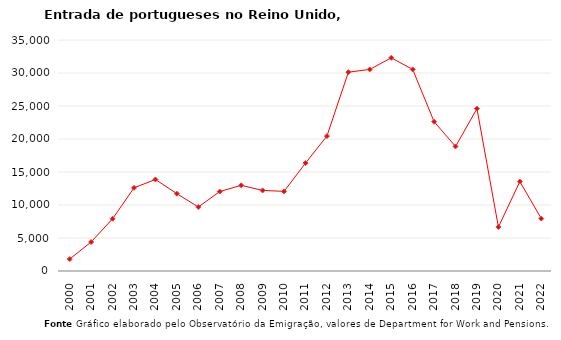
| Category | Entradas |
|---|---|
| 2000.0 | 1811 |
| 2001.0 | 4396 |
| 2002.0 | 7915 |
| 2003.0 | 12603 |
| 2004.0 | 13867 |
| 2005.0 | 11712 |
| 2006.0 | 9696 |
| 2007.0 | 12039 |
| 2008.0 | 12983 |
| 2009.0 | 12211 |
| 2010.0 | 12064 |
| 2011.0 | 16347 |
| 2012.0 | 20443 |
| 2013.0 | 30121 |
| 2014.0 | 30546 |
| 2015.0 | 32301 |
| 2016.0 | 30543 |
| 2017.0 | 22622 |
| 2018.0 | 18871 |
| 2019.0 | 24593 |
| 2020.0 | 6664 |
| 2021.0 | 13551 |
| 2022.0 | 7941 |